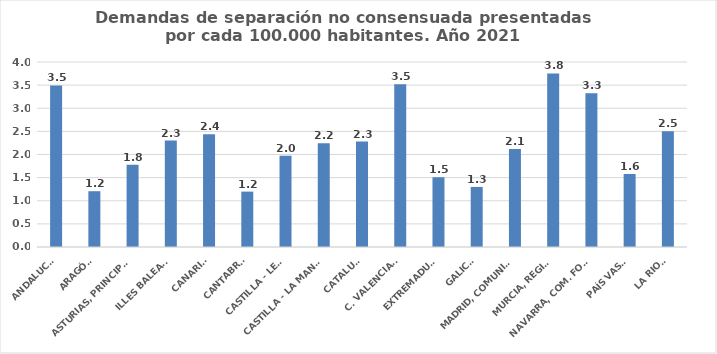
| Category | Series 0 |
|---|---|
| ANDALUCÍA | 3.494 |
| ARAGÓN | 1.206 |
| ASTURIAS, PRINCIPADO | 1.779 |
| ILLES BALEARS | 2.302 |
| CANARIAS | 2.439 |
| CANTABRIA | 1.198 |
| CASTILLA - LEÓN | 1.972 |
| CASTILLA - LA MANCHA | 2.244 |
| CATALUÑA | 2.28 |
| C. VALENCIANA | 3.519 |
| EXTREMADURA | 1.51 |
| GALICIA | 1.298 |
| MADRID, COMUNIDAD | 2.118 |
| MURCIA, REGIÓN | 3.754 |
| NAVARRA, COM. FORAL | 3.326 |
| PAÍS VASCO | 1.581 |
| LA RIOJA | 2.502 |